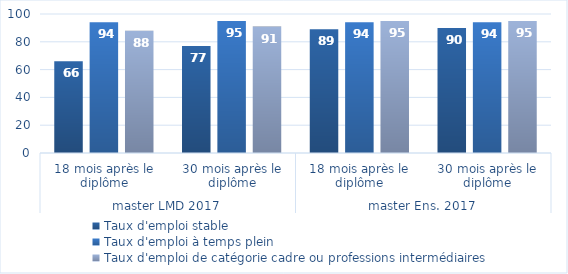
| Category | Taux d'emploi stable | Taux d'emploi à temps plein | Taux d'emploi de catégorie cadre ou professions intermédiaires |
|---|---|---|---|
| 0 | 66 | 94 | 88 |
| 1 | 77 | 95 | 91 |
| 2 | 89 | 94 | 95 |
| 3 | 90 | 94 | 95 |